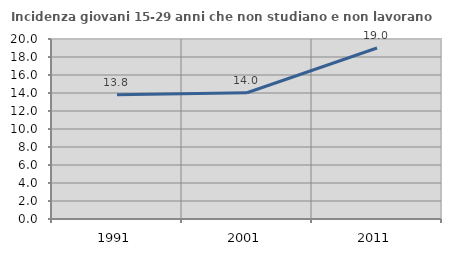
| Category | Incidenza giovani 15-29 anni che non studiano e non lavorano  |
|---|---|
| 1991.0 | 13.793 |
| 2001.0 | 14.024 |
| 2011.0 | 19 |